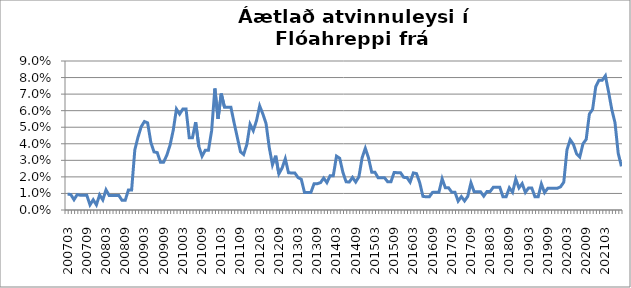
| Category | Series 0 |
|---|---|
| 200703 | 0.01 |
| 200704 | 0.009 |
| 200705 | 0.006 |
| 200706 | 0.009 |
| 200707 | 0.009 |
| 200708 | 0.009 |
| 200709 | 0.009 |
| 200710 | 0.003 |
| 200711 | 0.006 |
| 200712 | 0.003 |
| 200801 | 0.009 |
| 200802 | 0.006 |
| 200803 | 0.012 |
| 200804 | 0.009 |
| 200805 | 0.009 |
| 200806 | 0.009 |
| 200807 | 0.009 |
| 200808 | 0.006 |
| 200809 | 0.006 |
| 200810 | 0.012 |
| 200811 | 0.012 |
| 200812 | 0.036 |
| 200901 | 0.044 |
| 200902 | 0.05 |
| 200903 | 0.053 |
| 200904 | 0.053 |
| 200905 | 0.041 |
| 200906 | 0.035 |
| 200907 | 0.035 |
| 200908 | 0.029 |
| 200909 | 0.029 |
| 200910 | 0.033 |
| 200911 | 0.039 |
| 200912 | 0.048 |
| 201001 | 0.061 |
| 201002 | 0.058 |
| 201003 | 0.061 |
| 201004 | 0.061 |
| 201005 | 0.044 |
| 201006 | 0.044 |
| 201007 | 0.053 |
| 201008 | 0.038 |
| 201009 | 0.032 |
| 201010 | 0.036 |
| 201011 | 0.036 |
| 201012 | 0.048 |
| 201101 | 0.073 |
| 201102 | 0.055 |
| 201103 | 0.07 |
| 201104 | 0.062 |
| 201105 | 0.062 |
| 201106 | 0.062 |
| 201107 | 0.053 |
| 201108 | 0.044 |
| 201109 | 0.035 |
| 201110 | 0.034 |
| 201111 | 0.04 |
| 201112 | 0.052 |
| 201201 | 0.048 |
| 201202 | 0.054 |
| 201203 | 0.063 |
| 201204 | 0.058 |
| 201205 | 0.052 |
| 201206 | 0.038 |
| 201207 | 0.027 |
| 201208 | 0.033 |
| 201209 | 0.022 |
| 201210 | 0.025 |
| 201211 | 0.031 |
| 201212 | 0.023 |
| 201301 | 0.022 |
| 201302 | 0.022 |
| 201303 | 0.02 |
| 201304 | 0.019 |
| 201305 | 0.011 |
| 201306 | 0.011 |
| 201307 | 0.011 |
| 201308 | 0.016 |
| 201309 | 0.016 |
| 201310 | 0.017 |
| 201311 | 0.019 |
| 201312 | 0.017 |
| 201401 | 0.021 |
| 201402 | 0.021 |
| 201403 | 0.033 |
| 201404 | 0.031 |
| 201405 | 0.023 |
| 201406 | 0.017 |
| 201407 | 0.017 |
| 201408 | 0.02 |
| 201409 | 0.017 |
| 201410 | 0.02 |
| 201411 | 0.032 |
| 201412 | 0.037 |
| 201501 | 0.031 |
| 201502 | 0.023 |
| 201503 | 0.023 |
| 201504 | 0.019 |
| 201505 | 0.019 |
| 201506 | 0.019 |
| 201507 | 0.017 |
| 201508 | 0.017 |
| 201509 | 0.023 |
| 201510 | 0.023 |
| 201511 | 0.023 |
| 201512 | 0.02 |
| 201601 | 0.02 |
| 201602 | 0.017 |
| 201603 | 0.022 |
| 201604 | 0.022 |
| 201605 | 0.016 |
| 201606 | 0.008 |
| 201607 | 0.008 |
| 201608 | 0.008 |
| 201609 | 0.011 |
| 201610 | 0.011 |
| 201611 | 0.011 |
| 201612 | 0.019 |
| 201701 | 0.013 |
| 201702 | 0.013 |
| 201703 | 0.011 |
| 201704 | 0.011 |
| 201705 | 0.005 |
| 201706 | 0.008 |
| 201707 | 0.005 |
| 201708 | 0.008 |
| 201709 | 0.016 |
| 201710 | 0.011 |
| 201711 | 0.011 |
| 201712 | 0.011 |
| 201801 | 0.008 |
| 201802 | 0.011 |
| 201803 | 0.011 |
| 201804 | 0.014 |
| 201805 | 0.014 |
| 201806 | 0.014 |
| 201807 | 0.008 |
| 201808 | 0.008 |
| 201809 | 0.013 |
| 201810 | 0.011 |
| 201811 | 0.019 |
| 201812 | 0.013 |
| 201901 | 0.016 |
| 201902 | 0.011 |
| 201903 | 0.013 |
| 201904 | 0.013 |
| 201905 | 0.008 |
| 201906 | 0.008 |
| 201907 | 0.016 |
| 201908 | 0.01 |
| 201909 | 0.013 |
| 201910 | 0.013 |
| 201911 | 0.013 |
| 201912 | 0.013 |
| 202001 | 0.014 |
| 202002 | 0.017 |
| 202003 | 0.036 |
| 202004 | 0.042 |
| 202005 | 0.04 |
| 202006 | 0.034 |
| 202007 | 0.032 |
| 202008 | 0.04 |
| 202009 | 0.043 |
| 202010 | 0.058 |
| 202011 | 0.061 |
| 202012 | 0.075 |
| 202101 | 0.078 |
| 202102 | 0.078 |
| 202103 | 0.081 |
| 202104 | 0.071 |
| 202105 | 0.061 |
| 202106 | 0.053 |
| 202107 | 0.034 |
| 202108 | 0.026 |